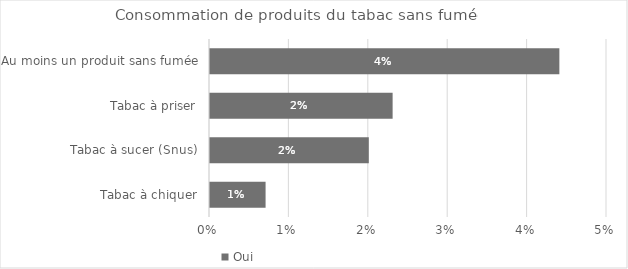
| Category | Oui |
|---|---|
| Au moins un produit sans fumée | 0.044 |
| Tabac à priser | 0.023 |
| Tabac à sucer (Snus) | 0.02 |
| Tabac à chiquer | 0.007 |